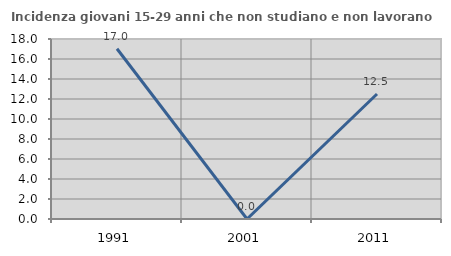
| Category | Incidenza giovani 15-29 anni che non studiano e non lavorano  |
|---|---|
| 1991.0 | 17.027 |
| 2001.0 | 0 |
| 2011.0 | 12.5 |